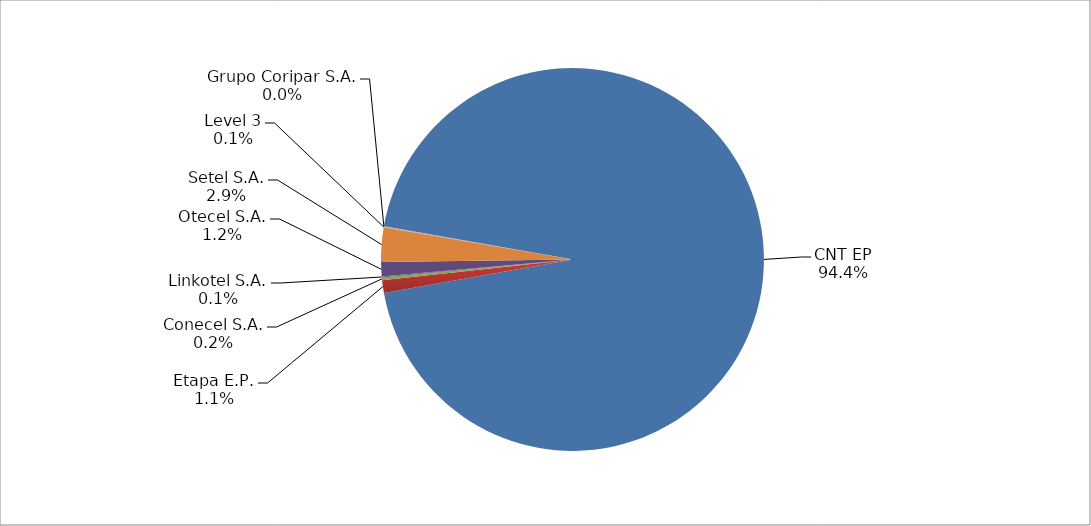
| Category | Series 0 |
|---|---|
| CNT EP | 2119 |
| Etapa E.P. | 24 |
| Conecel S.A. | 5 |
| Linkotel S.A. | 2 |
| Otecel S.A. | 27 |
| Setel S.A. | 65 |
| Level 3 | 1 |
| Grupo Coripar S.A. | 1 |